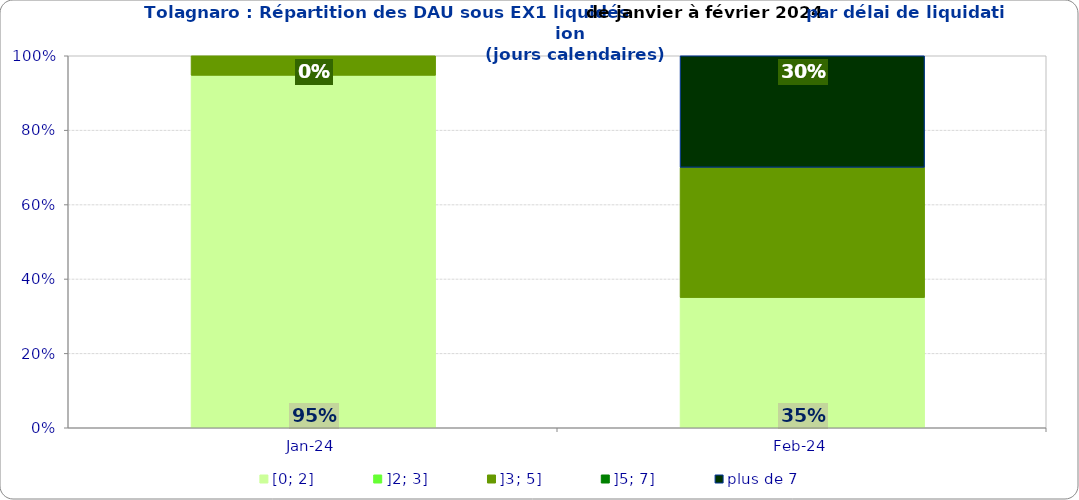
| Category | [0; 2] | ]2; 3] | ]3; 5] | ]5; 7] | plus de 7 |
|---|---|---|---|---|---|
| 2024-01-01 | 0.947 | 0 | 0.053 | 0 | 0 |
| 2024-02-01 | 0.35 | 0 | 0.35 | 0 | 0.3 |